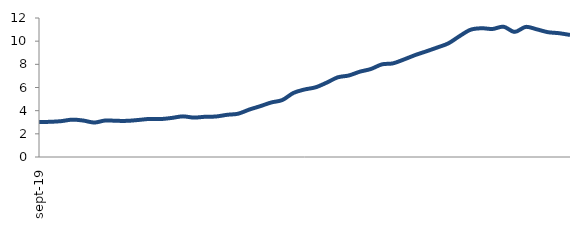
| Category | Series 0 |
|---|---|
| 2019-09-01 | 3.023 |
| 2019-10-01 | 3.036 |
| 2019-11-01 | 3.095 |
| 2019-12-01 | 3.225 |
| 2020-01-01 | 3.148 |
| 2020-02-01 | 2.975 |
| 2020-03-01 | 3.153 |
| 2020-04-01 | 3.122 |
| 2020-05-01 | 3.123 |
| 2020-06-01 | 3.198 |
| 2020-07-01 | 3.289 |
| 2020-08-01 | 3.275 |
| 2020-09-01 | 3.372 |
| 2020-10-01 | 3.508 |
| 2020-11-01 | 3.402 |
| 2020-12-01 | 3.472 |
| 2021-01-01 | 3.496 |
| 2021-02-01 | 3.642 |
| 2021-03-01 | 3.737 |
| 2021-04-01 | 4.091 |
| 2021-05-01 | 4.388 |
| 2021-06-01 | 4.708 |
| 2021-07-01 | 4.92 |
| 2021-08-01 | 5.531 |
| 2021-09-01 | 5.826 |
| 2021-10-01 | 6.015 |
| 2021-11-01 | 6.418 |
| 2021-12-01 | 6.877 |
| 2022-01-01 | 7.036 |
| 2022-02-01 | 7.363 |
| 2022-03-01 | 7.597 |
| 2022-04-01 | 7.997 |
| 2022-05-01 | 8.085 |
| 2022-06-01 | 8.423 |
| 2022-07-01 | 8.799 |
| 2022-08-01 | 9.118 |
| 2022-09-01 | 9.453 |
| 2022-10-01 | 9.809 |
| 2022-11-01 | 10.425 |
| 2022-12-01 | 10.982 |
| 2023-01-01 | 11.115 |
| 2023-02-01 | 11.054 |
| 2023-03-01 | 11.245 |
| 2023-04-01 | 10.801 |
| 2023-05-01 | 11.231 |
| 2023-06-01 | 11.022 |
| 2023-07-01 | 10.776 |
| 2023-08-01 | 10.689 |
| 2023-09-01 | 10.536 |